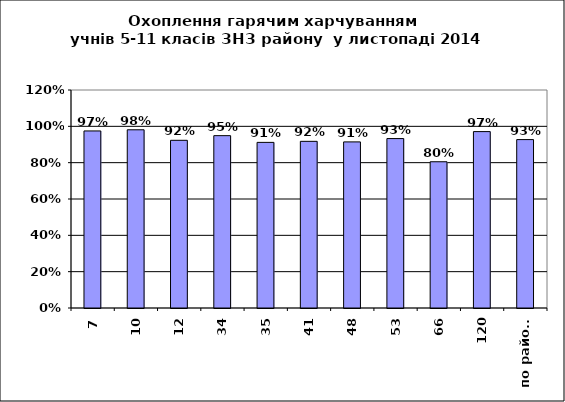
| Category | Series 0 |
|---|---|
| 7 | 0.975 |
| 10 | 0.981 |
| 12 | 0.923 |
| 34 | 0.949 |
| 35 | 0.912 |
| 41 | 0.917 |
| 48 | 0.914 |
| 53 | 0.933 |
| 66 | 0.805 |
| 120 | 0.971 |
| по району | 0.927 |